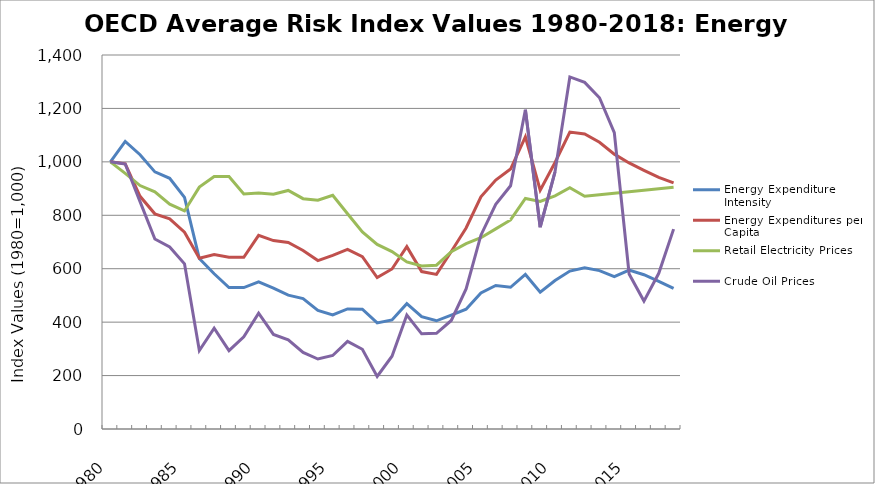
| Category | Energy Expenditure Intensity | Energy Expenditures per Capita | Retail Electricity Prices | Crude Oil Prices |
|---|---|---|---|---|
| 1980.0 | 1000 | 1000 | 1000 | 1000 |
| 1981.0 | 1076.409 | 992.524 | 957.037 | 992.015 |
| 1982.0 | 1026.716 | 870.961 | 911.357 | 851.093 |
| 1983.0 | 962.52 | 805.406 | 887.499 | 711.336 |
| 1984.0 | 938.551 | 786.765 | 841.87 | 681.381 |
| 1985.0 | 866.744 | 736.445 | 816.315 | 618.374 |
| 1986.0 | 638.292 | 639.35 | 905.51 | 293.7 |
| 1987.0 | 581.081 | 653.082 | 944.922 | 377.538 |
| 1988.0 | 529.264 | 642.992 | 945.189 | 293.428 |
| 1989.0 | 529.484 | 642.556 | 879.476 | 345.233 |
| 1990.0 | 550.798 | 724.947 | 883.744 | 433.726 |
| 1991.0 | 527.259 | 705.209 | 878.761 | 353.848 |
| 1992.0 | 500.889 | 698.037 | 892.959 | 333.535 |
| 1993.0 | 488.239 | 668.118 | 862.146 | 286.86 |
| 1994.0 | 443.875 | 630.477 | 856.131 | 261.873 |
| 1995.0 | 427.14 | 650.109 | 874.921 | 275.254 |
| 1996.0 | 449.386 | 672.314 | 805.621 | 327.801 |
| 1997.0 | 448.7 | 645.092 | 737.354 | 298.357 |
| 1998.0 | 397.335 | 566.922 | 690.818 | 196.999 |
| 1999.0 | 408.268 | 599.015 | 663.939 | 272.421 |
| 2000.0 | 468.995 | 682.502 | 625.605 | 426.636 |
| 2001.0 | 420.777 | 589.394 | 610.561 | 356.302 |
| 2002.0 | 405.063 | 578.64 | 613.059 | 358.355 |
| 2003.0 | 426.242 | 664.438 | 663.737 | 406.165 |
| 2004.0 | 448.638 | 752.383 | 693.528 | 524.52 |
| 2005.0 | 509.033 | 869.062 | 716.075 | 725.519 |
| 2006.0 | 537.257 | 932.108 | 749.264 | 840.873 |
| 2007.0 | 530.54 | 972.972 | 782.513 | 910.359 |
| 2008.0 | 578.497 | 1093.747 | 862.874 | 1195.008 |
| 2009.0 | 512.452 | 894.145 | 851.653 | 755.327 |
| 2010.0 | 555.769 | 997.71 | 872.654 | 962.731 |
| 2011.0 | 591.296 | 1111.533 | 902.931 | 1317.955 |
| 2012.0 | 603.145 | 1104.069 | 871.408 | 1297.452 |
| 2013.0 | 592.778 | 1073.431 | 876.874 | 1240.008 |
| 2014.0 | 570.693 | 1028.813 | 882.374 | 1109.479 |
| 2015.0 | 594.839 | 995.886 | 887.909 | 580.313 |
| 2016.0 | 577.461 | 968.449 | 893.479 | 478.802 |
| 2017.0 | 552.579 | 942.093 | 899.083 | 582.819 |
| 2018.0 | 526.09 | 921.383 | 904.722 | 748.243 |